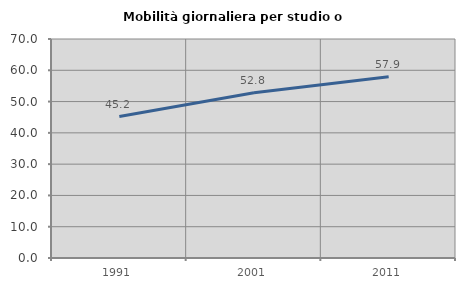
| Category | Mobilità giornaliera per studio o lavoro |
|---|---|
| 1991.0 | 45.203 |
| 2001.0 | 52.796 |
| 2011.0 | 57.928 |